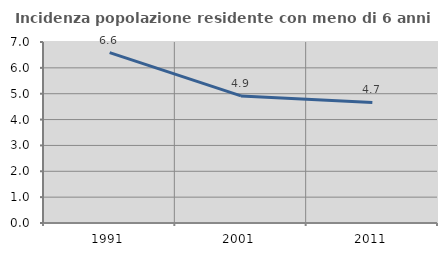
| Category | Incidenza popolazione residente con meno di 6 anni |
|---|---|
| 1991.0 | 6.592 |
| 2001.0 | 4.915 |
| 2011.0 | 4.661 |